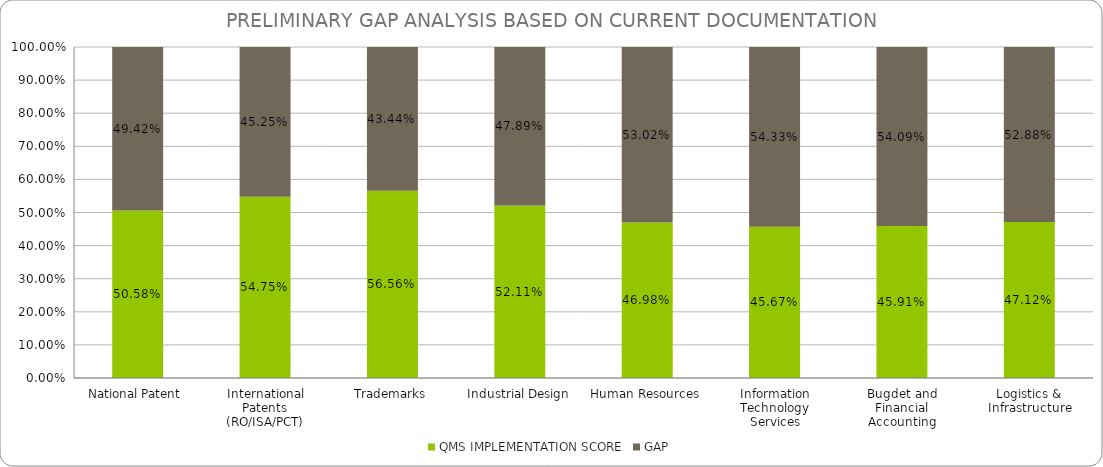
| Category | QMS IMPLEMENTATION SCORE | GAP |
|---|---|---|
| National Patent  | 0.506 | 0.494 |
| International Patents (RO/ISA/PCT) | 0.548 | 0.452 |
| Trademarks | 0.566 | 0.434 |
| Industrial Design | 0.521 | 0.479 |
| Human Resources | 0.47 | 0.53 |
| Information Technology Services | 0.457 | 0.543 |
| Bugdet and Financial Accounting | 0.459 | 0.541 |
| Logistics & Infrastructure | 0.471 | 0.529 |